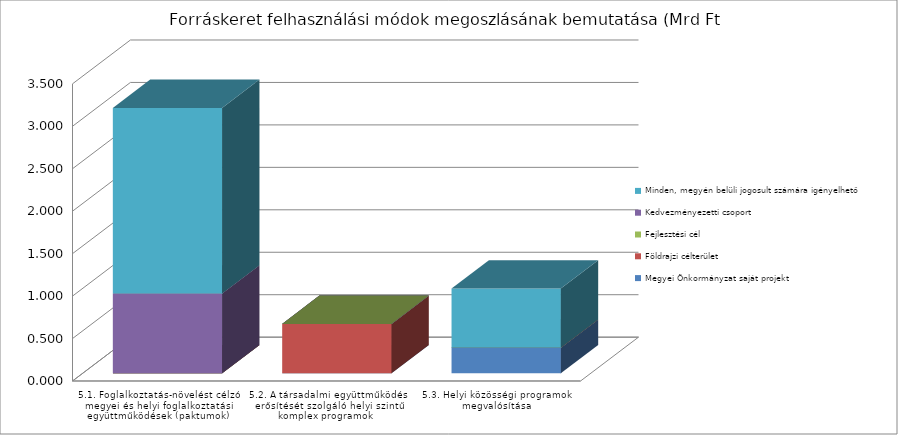
| Category | Megyei Önkormányzat saját projekt | Földrajzi célterület  | Fejlesztési cél  | Kedvezményezetti csoport | Minden, megyén belüli jogosult számára igényelhető |
|---|---|---|---|---|---|
| 5.1. Foglalkoztatás-növelést célzó megyei és helyi foglalkoztatási együttműködések (paktumok) | 0 | 0 | 0 | 0.938 | 2.187 |
| 5.2. A társadalmi együttműködés erősítését szolgáló helyi szintű komplex programok  | 0 | 0.581 | 0 | 0 | 0 |
| 5.3. Helyi közösségi programok megvalósítása | 0.3 | 0 | 0 | 0 | 0.697 |